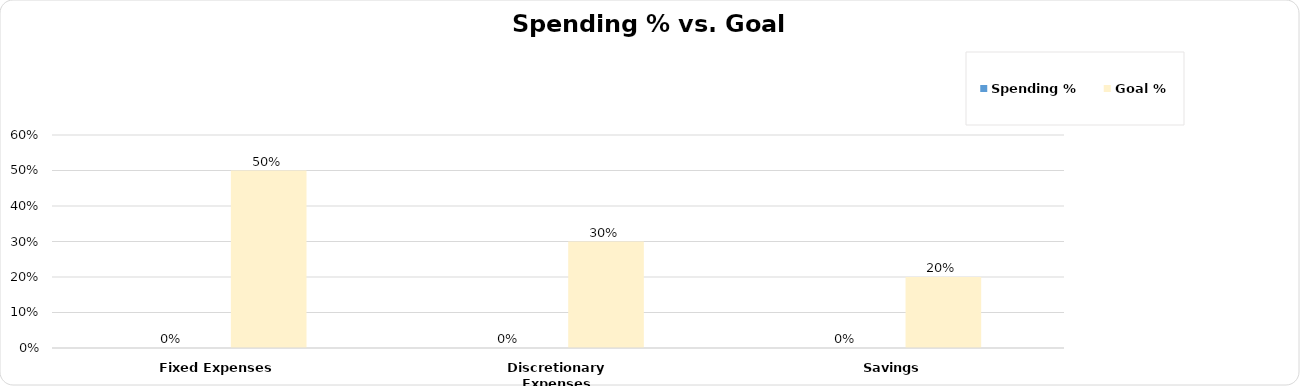
| Category | Spending % | Goal % |
|---|---|---|
| 0 | 0 |  |
| 1 | 0 |  |
| 2 | 0 |  |